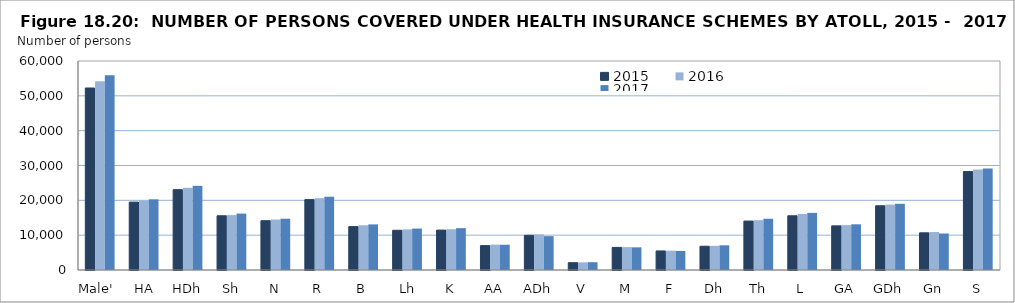
| Category | 2015  | 2016 | 2017  |
|---|---|---|---|
| Male'  | 52253 | 54165 | 55899 |
|  HA | 19492 | 19947 | 20287 |
| HDh | 23057 | 23604 | 24162 |
| Sh | 15572 | 15761 | 16192 |
| N | 14154 | 14498 | 14727 |
| R | 20204 | 20619 | 21032 |
| B | 12455 | 12845 | 13091 |
|  Lh | 11405 | 11665 | 11895 |
| K | 11458 | 11711 | 12010 |
| AA | 6994 | 7282 | 7248 |
| ADh | 9969 | 10228 | 9714 |
| V | 2099 | 2200 | 2241 |
| M | 6489 | 6580 | 6504 |
| F | 5469 | 5556 | 5477 |
| Dh | 6822 | 6940 | 7084 |
| Th | 14052 | 14312 | 14715 |
| L | 15563 | 16091 | 16392 |
| GA | 12673 | 12885 | 13119 |
| GDh | 18440 | 18775 | 19003 |
| Gn | 10673 | 10892 | 10481 |
| S | 28252 | 28831 | 29131 |